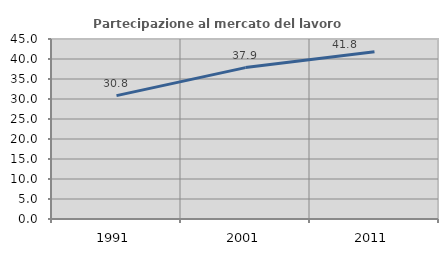
| Category | Partecipazione al mercato del lavoro  femminile |
|---|---|
| 1991.0 | 30.841 |
| 2001.0 | 37.851 |
| 2011.0 | 41.801 |